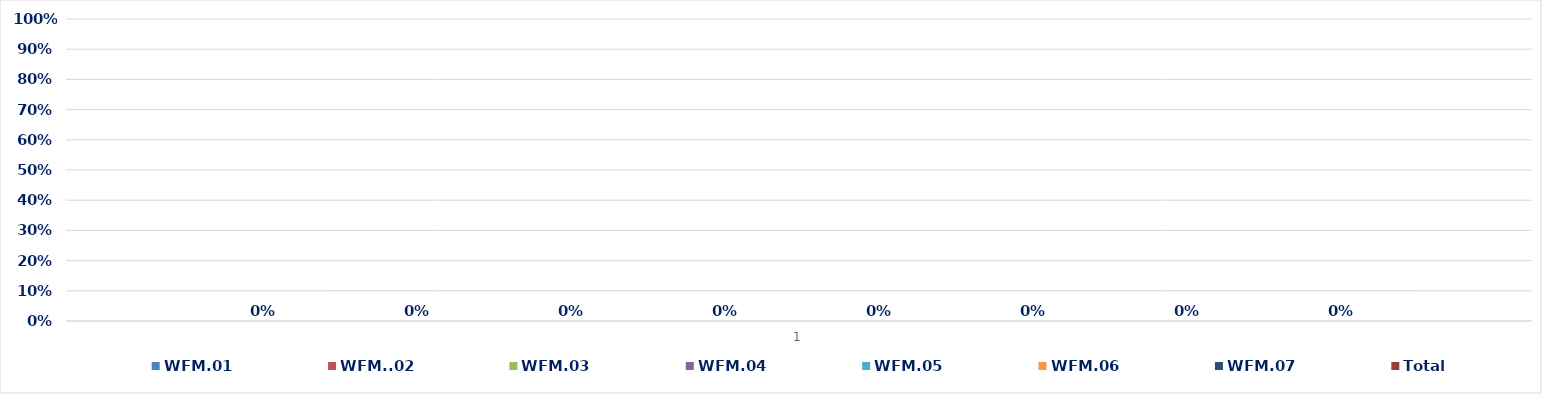
| Category | WFM.01 | WFM..02 | WFM.03 | WFM.04 | WFM.05 | WFM.06 | WFM.07 | Total |
|---|---|---|---|---|---|---|---|---|
| 0 | 0 | 0 | 0 | 0 | 0 | 0 | 0 | 0 |